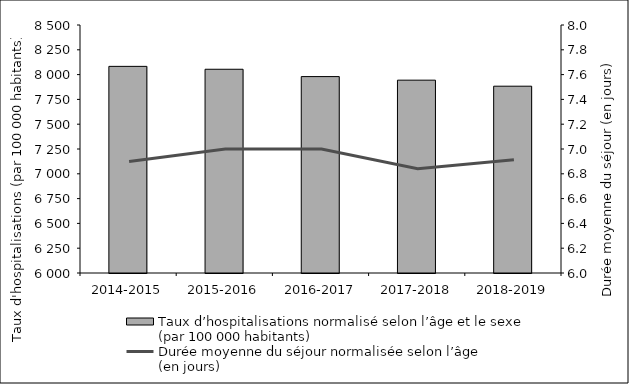
| Category | Taux d’hospitalisations normalisé selon l’âge et le sexe 
(par 100 000 habitants) |
|---|---|
| 2014-2015 | 8083 |
| 2015-2016 | 8053.914 |
| 2016-2017 | 7980 |
| 2017-2018 | 7943.875 |
| 2018-2019 | 7883.11 |